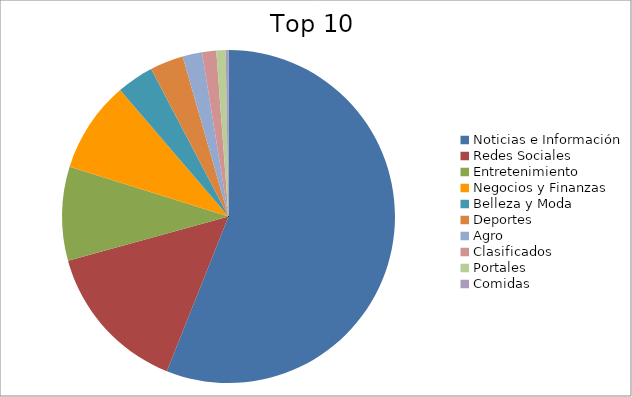
| Category | Series 0 |
|---|---|
| Noticias e Información | 55.88 |
| Redes Sociales | 14.63 |
| Entretenimiento | 9.1 |
| Negocios y Finanzas | 8.86 |
| Belleza y Moda | 3.58 |
| Deportes | 3.24 |
| Agro | 1.89 |
| Clasificados | 1.37 |
| Portales | 0.9 |
| Comidas | 0.27 |